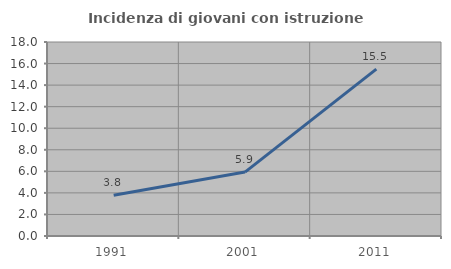
| Category | Incidenza di giovani con istruzione universitaria |
|---|---|
| 1991.0 | 3.783 |
| 2001.0 | 5.929 |
| 2011.0 | 15.487 |